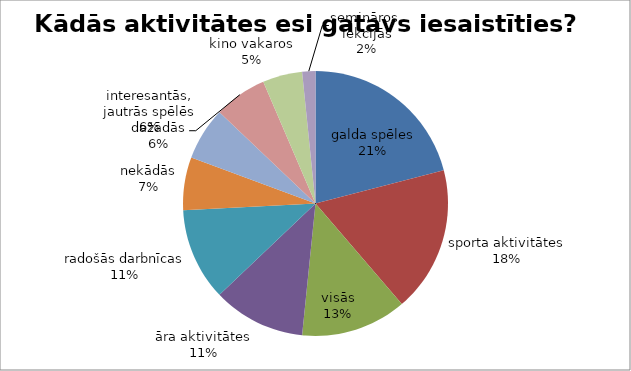
| Category | Kādās aktivitātes esi gatavs iesaistīties? |
|---|---|
| galda spēles | 13 |
| sporta aktivitātes | 11 |
| visās | 8 |
| āra aktivitātes | 7 |
| radošās darbnīcas | 7 |
| nekādās | 4 |
| interesantās, jautrās spēlēs | 4 |
| dažādās | 4 |
| kino vakaros | 3 |
| semināros, lekcijās | 1 |